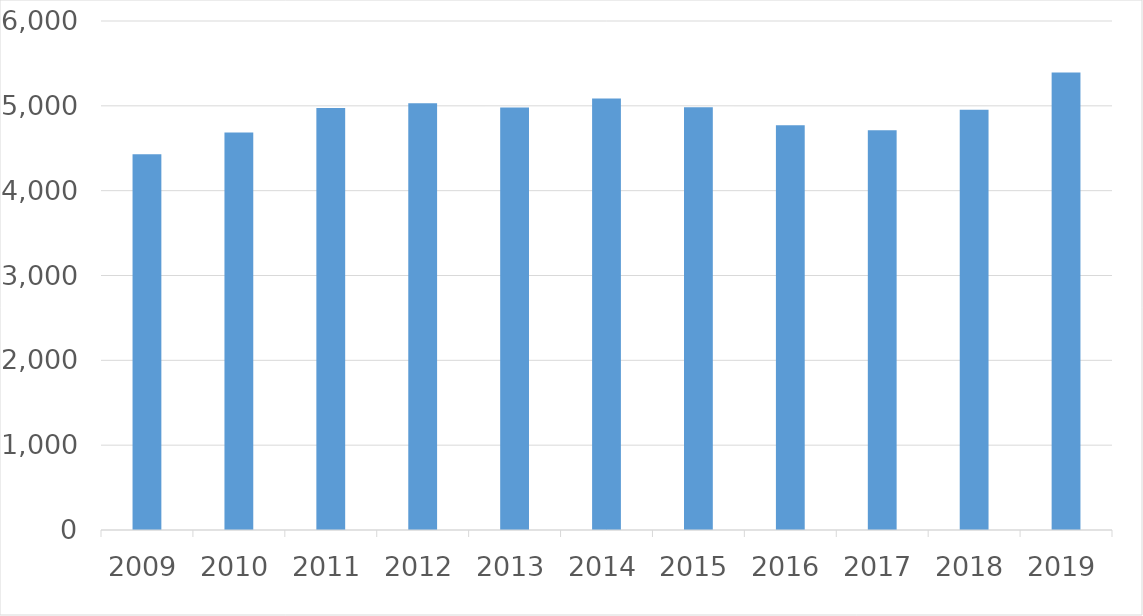
| Category | Series 0 |
|---|---|
| 2009 | 4428 |
| 2010 | 4686 |
| 2011 | 4974 |
| 2012 | 5029 |
| 2013 | 4979 |
| 2014 | 5086 |
| 2015 | 4983 |
| 2016 | 4771 |
| 2017 | 4712 |
| 2018 | 4954 |
| 2019 | 5394 |